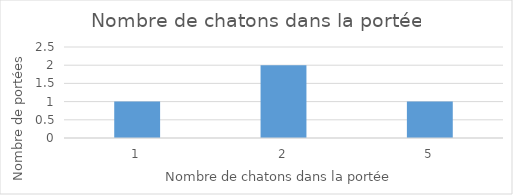
| Category | Series 0 |
|---|---|
| 1.0 | 1 |
| 2.0 | 2 |
| 5.0 | 1 |